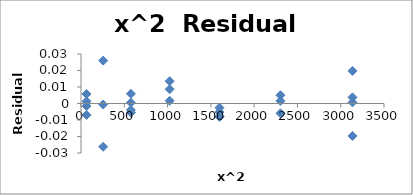
| Category | Series 0 |
|---|---|
| 64.0 | -0.007 |
| 64.0 | 0.006 |
| 64.0 | -0.002 |
| 64.0 | 0.001 |
| 256.0 | -0.026 |
| 256.0 | -0.001 |
| 256.0 | 0.026 |
| 576.0 | -0.006 |
| 576.0 | 0.001 |
| 576.0 | 0.006 |
| 576.0 | -0.004 |
| 1024.0 | 0.002 |
| 1024.0 | 0.009 |
| 1024.0 | 0.014 |
| 1600.0 | -0.005 |
| 1600.0 | -0.003 |
| 1600.0 | -0.008 |
| 1600.0 | -0.008 |
| 2304.0 | 0.005 |
| 2304.0 | 0.002 |
| 2304.0 | -0.006 |
| 3136.0 | 0.001 |
| 3136.0 | 0.02 |
| 3136.0 | 0.004 |
| 3136.0 | -0.02 |